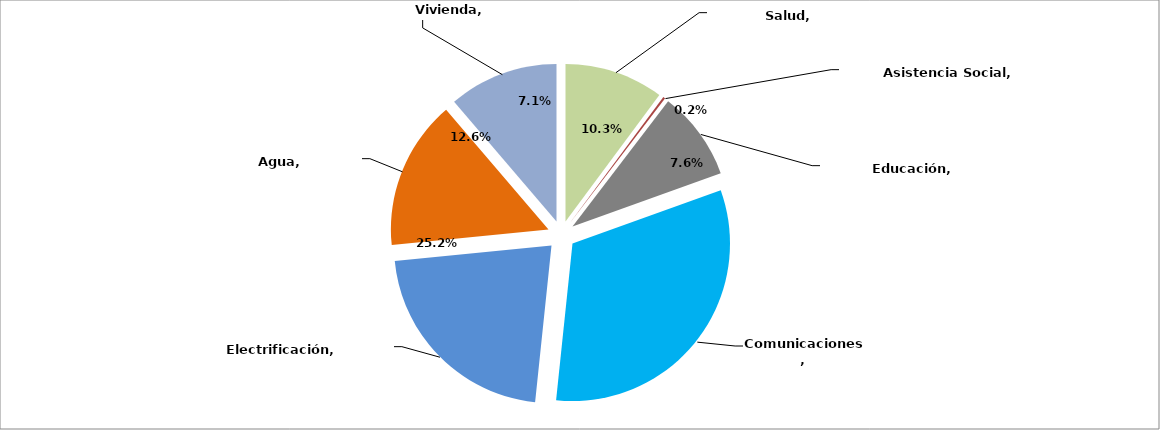
| Category | Series 0 |
|---|---|
| Salud | 141289128.55 |
| Asistencia Social | 3175600.4 |
| Educación | 126882148.67 |
| Comunicaciones | 447193455.91 |
| Electrificación | 302973432.09 |
| Agua | 212695644.04 |
| Vivienda | 156671974.73 |